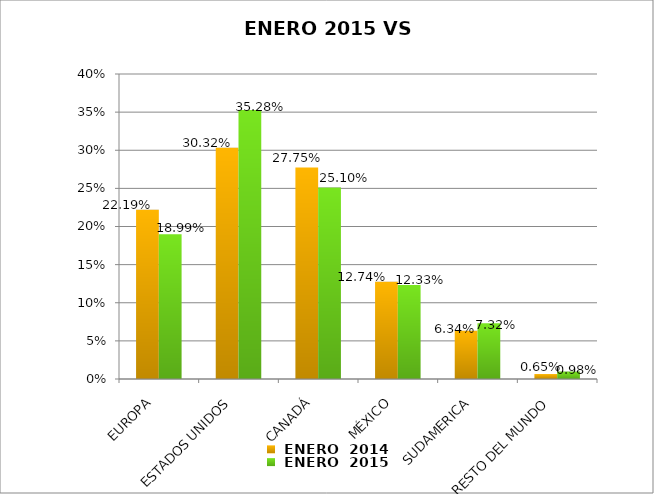
| Category |  ENERO  2014 |  ENERO  2015 |
|---|---|---|
| EUROPA | 0.222 | 0.19 |
| ESTADOS UNIDOS | 0.303 | 0.353 |
| CANADÁ | 0.278 | 0.251 |
| MÉXICO | 0.127 | 0.123 |
| SUDAMERICA | 0.063 | 0.073 |
| RESTO DEL MUNDO | 0.007 | 0.01 |